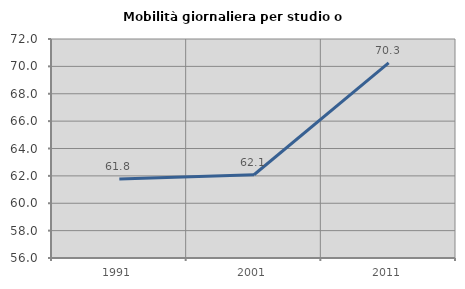
| Category | Mobilità giornaliera per studio o lavoro |
|---|---|
| 1991.0 | 61.765 |
| 2001.0 | 62.081 |
| 2011.0 | 70.261 |